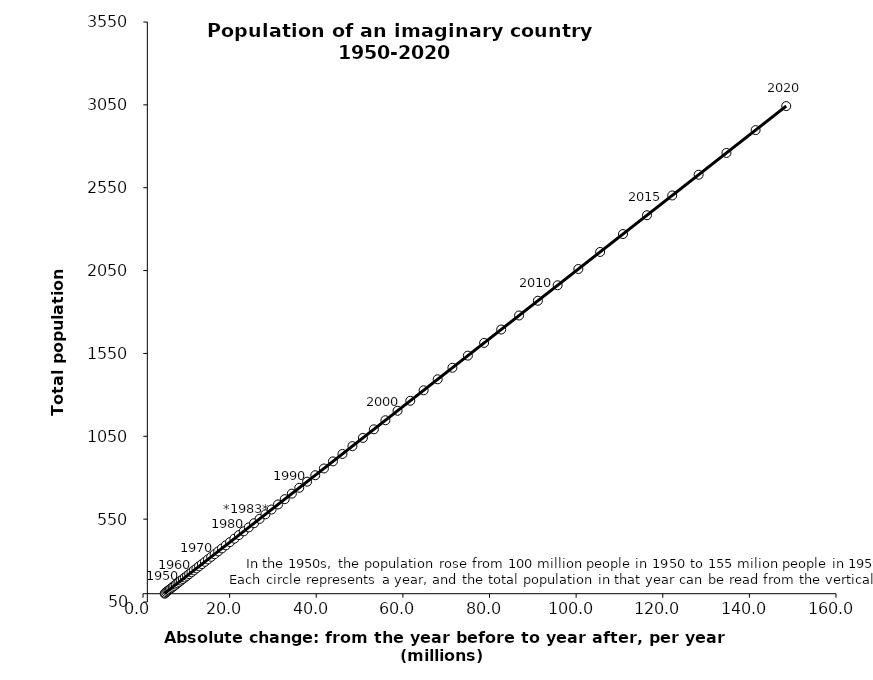
| Category | Series 0 |
|---|---|
| 5.0 | 100 |
| 5.125 | 105 |
| 5.381250000000001 | 110.25 |
| 5.650312500000005 | 115.762 |
| 5.9328281250000074 | 121.551 |
| 6.229469531250011 | 127.628 |
| 6.5409430078125155 | 134.01 |
| 6.867990158203142 | 140.71 |
| 7.211389666113291 | 147.746 |
| 7.571959149418944 | 155.133 |
| 7.950557106889903 | 162.889 |
| 8.34808496223441 | 171.034 |
| 8.765489210346118 | 179.586 |
| 9.203763670863424 | 188.565 |
| 9.663951854406605 | 197.993 |
| 10.147149447126935 | 207.893 |
| 10.654506919483282 | 218.287 |
| 11.187232265457439 | 229.202 |
| 11.746593878730309 | 240.662 |
| 12.33392357266682 | 252.695 |
| 12.950619751300167 | 265.33 |
| 13.598150738865172 | 278.596 |
| 14.278058275808434 | 292.526 |
| 14.991961189598868 | 307.152 |
| 15.74155924907879 | 322.51 |
| 16.528637211532725 | 338.635 |
| 17.355069072109387 | 355.567 |
| 18.22282252571486 | 373.346 |
| 19.133963652000602 | 392.013 |
| 20.09066183460064 | 411.614 |
| 21.095194926330663 | 432.194 |
| 22.149954672647198 | 453.804 |
| 23.257452406279555 | 476.494 |
| 24.420325026593503 | 500.319 |
| 25.641341277923175 | 525.335 |
| 26.923408341819368 | 551.602 |
| 28.26957875891037 | 579.182 |
| 29.683057696855883 | 608.141 |
| 31.16721058169867 | 638.548 |
| 32.72557111078362 | 670.475 |
| 34.36184966632277 | 703.999 |
| 36.079942149638896 | 739.199 |
| 37.88393925712086 | 776.159 |
| 39.778136219976886 | 814.967 |
| 41.76704303097574 | 855.715 |
| 43.855395182524546 | 898.501 |
| 46.04816494165078 | 943.426 |
| 48.350573188733335 | 990.597 |
| 50.76810184816998 | 1040.127 |
| 53.306506940578515 | 1092.133 |
| 55.97183228760741 | 1146.74 |
| 58.77042390198778 | 1204.077 |
| 61.70894509708717 | 1264.281 |
| 64.7943923519415 | 1327.495 |
| 68.03411196953857 | 1393.87 |
| 71.43581756801552 | 1463.563 |
| 75.00760844641638 | 1536.741 |
| 78.75798886873713 | 1613.578 |
| 82.6958883121739 | 1694.257 |
| 86.83068272778269 | 1778.97 |
| 91.1722168641719 | 1867.919 |
| 95.7308277073804 | 1961.315 |
| 100.51736909274939 | 2059.38 |
| 105.54323754738698 | 2162.349 |
| 110.82039942475626 | 2270.467 |
| 116.36141939599406 | 2383.99 |
| 122.17949036579375 | 2503.19 |
| 128.2884648840834 | 2628.349 |
| 134.70288812828767 | 2759.766 |
| 141.43803253470196 | 2897.755 |
| 148.50993416143706 | 3042.643 |